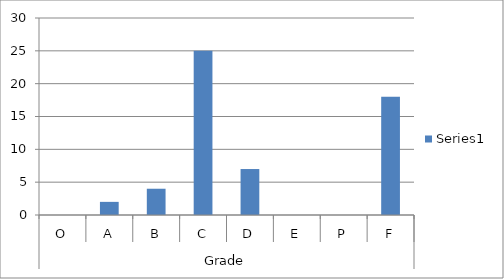
| Category | Series 0 |
|---|---|
| 0 | 0 |
| 1 | 2 |
| 2 | 4 |
| 3 | 25 |
| 4 | 7 |
| 5 | 0 |
| 6 | 0 |
| 7 | 18 |